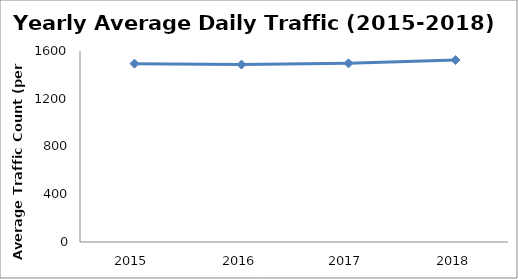
| Category | Series 0 |
|---|---|
| 2015.0 | 1494.145 |
| 2016.0 | 1486.15 |
| 2017.0 | 1496.644 |
| 2018.0 | 1523.962 |